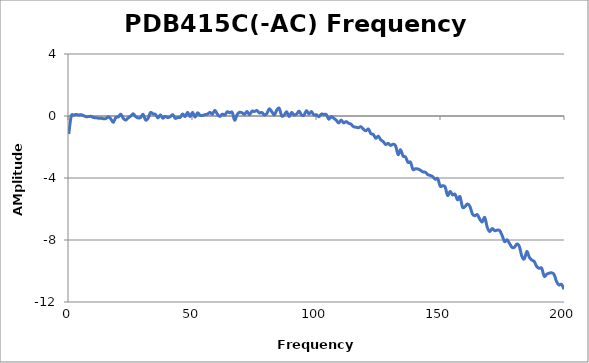
| Category | Series 0 |
|---|---|
| 0.3 | -1.161 |
| 1.2985 | -0.005 |
| 2.297 | 0.053 |
| 3.2955 | 0.099 |
| 4.294 | 0.066 |
| 5.2925 | 0.083 |
| 6.291 | 0.021 |
| 7.2895 | -0.043 |
| 8.288 | -0.038 |
| 9.2865 | -0.024 |
| 10.285 | -0.098 |
| 11.2835 | -0.116 |
| 12.282 | -0.141 |
| 13.2805 | -0.145 |
| 14.279 | -0.173 |
| 15.2775 | -0.165 |
| 16.276 | -0.051 |
| 17.2745 | -0.193 |
| 18.273 | -0.409 |
| 19.2715 | -0.093 |
| 20.27 | -0.064 |
| 21.2685 | 0.121 |
| 22.267 | -0.139 |
| 23.2655 | -0.267 |
| 24.264 | -0.122 |
| 25.2625 | -0.012 |
| 26.261 | 0.146 |
| 27.2595 | -0.035 |
| 28.258 | -0.124 |
| 29.2565 | -0.1 |
| 30.255 | 0.11 |
| 31.2535 | -0.254 |
| 32.252 | -0.155 |
| 33.2505 | 0.219 |
| 34.249 | 0.138 |
| 35.2475 | 0.105 |
| 36.246 | -0.124 |
| 37.2445 | 0.073 |
| 38.243 | -0.142 |
| 39.2415 | -0.024 |
| 40.24 | -0.103 |
| 41.2385 | -0.04 |
| 42.237 | 0.086 |
| 43.2355 | -0.15 |
| 44.234 | -0.091 |
| 45.2325 | -0.088 |
| 46.231 | 0.13 |
| 47.2295 | -0.038 |
| 48.228 | 0.239 |
| 49.2265 | -0.042 |
| 50.225 | 0.238 |
| 51.2235 | -0.075 |
| 52.222 | 0.205 |
| 53.2205 | 0.053 |
| 54.219 | 0.031 |
| 55.2175 | 0.087 |
| 56.216 | 0.119 |
| 57.2145 | 0.234 |
| 58.213 | 0.119 |
| 59.2115 | 0.367 |
| 60.21 | 0.124 |
| 61.2085 | -0.03 |
| 62.207 | 0.121 |
| 63.2055 | 0.063 |
| 64.204 | 0.274 |
| 65.2025 | 0.208 |
| 66.201 | 0.237 |
| 67.1995 | -0.271 |
| 68.198 | 0.096 |
| 69.1965 | 0.241 |
| 70.195 | 0.203 |
| 71.1935 | 0.109 |
| 72.192 | 0.296 |
| 73.1905 | 0.08 |
| 74.189 | 0.31 |
| 75.1875 | 0.292 |
| 76.186 | 0.353 |
| 77.1845 | 0.193 |
| 78.183 | 0.227 |
| 79.1815 | 0.068 |
| 80.18 | 0.16 |
| 81.1785 | 0.462 |
| 82.177 | 0.278 |
| 83.1755 | 0.063 |
| 84.174 | 0.379 |
| 85.1725 | 0.497 |
| 86.171 | 0.007 |
| 87.1695 | 0.064 |
| 88.168 | 0.277 |
| 89.1665 | -0.038 |
| 90.165 | 0.227 |
| 91.1635 | 0.07 |
| 92.162 | 0.125 |
| 93.1605 | 0.315 |
| 94.159 | 0.068 |
| 95.1575 | 0.06 |
| 96.156 | 0.346 |
| 97.1545 | 0.129 |
| 98.153 | 0.285 |
| 99.1515 | 0.069 |
| 100.15 | 0.084 |
| 101.149 | -0.046 |
| 102.147 | 0.124 |
| 103.146 | 0.095 |
| 104.144 | 0.096 |
| 105.143 | -0.205 |
| 106.141 | -0.036 |
| 107.14 | -0.146 |
| 108.138 | -0.266 |
| 109.136 | -0.449 |
| 110.135 | -0.265 |
| 111.134 | -0.445 |
| 112.132 | -0.362 |
| 113.131 | -0.465 |
| 114.129 | -0.528 |
| 115.128 | -0.689 |
| 116.126 | -0.724 |
| 117.125 | -0.755 |
| 118.123 | -0.693 |
| 119.121 | -0.857 |
| 120.12 | -0.956 |
| 121.119 | -0.837 |
| 122.117 | -1.135 |
| 123.116 | -1.192 |
| 124.114 | -1.438 |
| 125.113 | -1.301 |
| 126.111 | -1.532 |
| 127.109 | -1.655 |
| 128.108 | -1.837 |
| 129.107 | -1.767 |
| 130.105 | -1.898 |
| 131.104 | -1.819 |
| 132.102 | -1.924 |
| 133.101 | -2.488 |
| 134.099 | -2.172 |
| 135.098 | -2.581 |
| 136.096 | -2.644 |
| 137.095 | -2.995 |
| 138.093 | -2.977 |
| 139.092 | -3.45 |
| 140.09 | -3.401 |
| 141.089 | -3.42 |
| 142.087 | -3.497 |
| 143.086 | -3.606 |
| 144.084 | -3.629 |
| 145.083 | -3.783 |
| 146.081 | -3.834 |
| 147.08 | -3.916 |
| 148.078 | -4.081 |
| 149.077 | -4.039 |
| 150.075 | -4.525 |
| 151.074 | -4.498 |
| 152.072 | -4.574 |
| 153.071 | -5.128 |
| 154.069 | -4.862 |
| 155.068 | -5.088 |
| 156.066 | -5.046 |
| 157.064 | -5.409 |
| 158.063 | -5.203 |
| 159.062 | -5.877 |
| 160.06 | -5.85 |
| 161.059 | -5.673 |
| 162.057 | -5.831 |
| 163.056 | -6.316 |
| 164.054 | -6.435 |
| 165.053 | -6.364 |
| 166.051 | -6.66 |
| 167.049 | -6.84 |
| 168.048 | -6.547 |
| 169.047 | -7.182 |
| 170.045 | -7.453 |
| 171.044 | -7.258 |
| 172.042 | -7.398 |
| 173.041 | -7.365 |
| 174.039 | -7.386 |
| 175.038 | -7.707 |
| 176.036 | -8.101 |
| 177.034 | -7.987 |
| 178.033 | -8.225 |
| 179.032 | -8.471 |
| 180.03 | -8.465 |
| 181.029 | -8.253 |
| 182.027 | -8.432 |
| 183.026 | -9.06 |
| 184.024 | -9.219 |
| 185.023 | -8.742 |
| 186.021 | -9.114 |
| 187.02 | -9.292 |
| 188.018 | -9.394 |
| 189.017 | -9.715 |
| 190.015 | -9.83 |
| 191.014 | -9.822 |
| 192.012 | -10.337 |
| 193.011 | -10.208 |
| 194.009 | -10.142 |
| 195.008 | -10.118 |
| 196.006 | -10.226 |
| 197.005 | -10.683 |
| 198.003 | -10.903 |
| 199.002 | -10.859 |
| 200.0 | -11.175 |